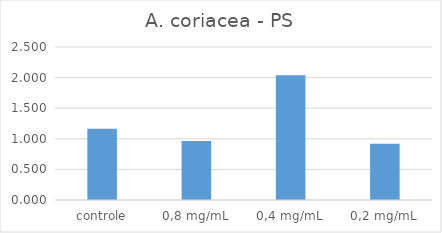
| Category | Series 0 |
|---|---|
| controle | 1.164 |
| 0,8 mg/mL | 0.966 |
| 0,4 mg/mL | 2.039 |
| 0,2 mg/mL | 0.92 |